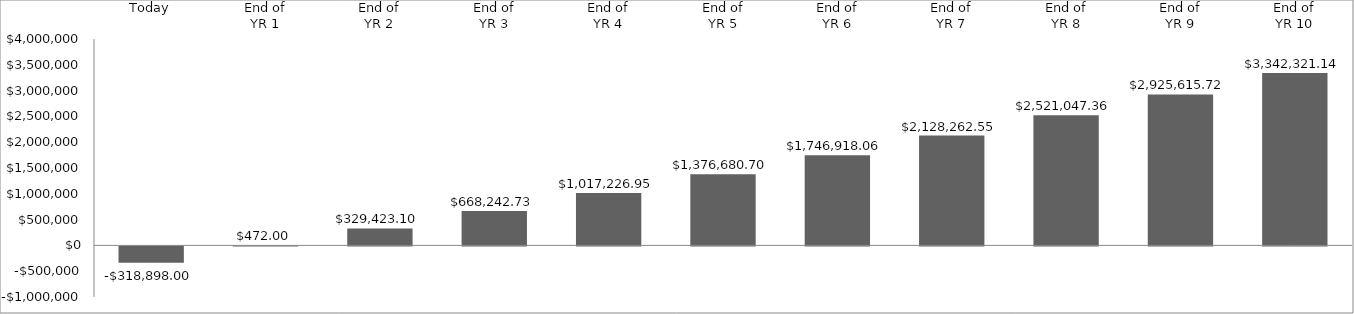
| Category | Annual Cash Flow |
|---|---|
| Today | -318898 |
| End of_x000d_YR 1 | 472 |
| End of_x000d_YR 2 | 329423.1 |
| End of_x000d_YR 3 | 668242.733 |
| End of_x000d_YR 4 | 1017226.955 |
| End of_x000d_YR 5 | 1376680.704 |
| End of_x000d_YR 6 | 1746918.065 |
| End of_x000d_YR 7 | 2128262.547 |
| End of_x000d_YR 8 | 2521047.363 |
| End of_x000d_YR 9 | 2925615.724 |
| End of_x000d_YR 10 | 3342321.136 |